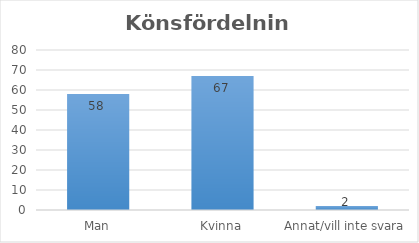
| Category | Series 0 |
|---|---|
| Man | 58 |
| Kvinna | 67 |
| Annat/vill inte svara | 2 |